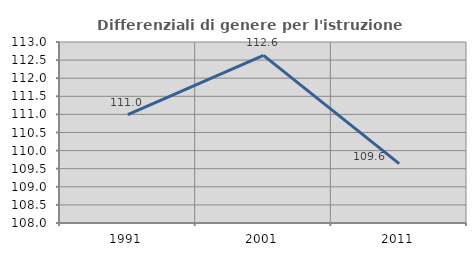
| Category | Differenziali di genere per l'istruzione superiore |
|---|---|
| 1991.0 | 110.995 |
| 2001.0 | 112.631 |
| 2011.0 | 109.64 |